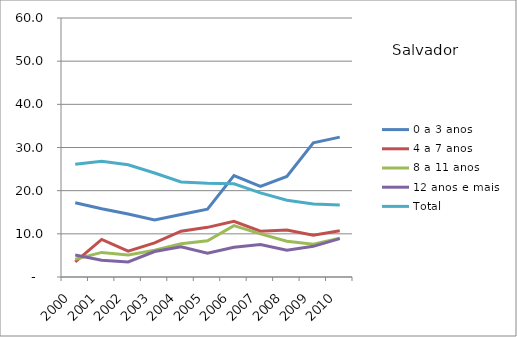
| Category | 0 a 3 anos | 4 a 7 anos | 8 a 11 anos | 12 anos e mais | Total |
|---|---|---|---|---|---|
| 2000.0 | 17.2 | 3.5 | 4.1 | 5.1 | 26.1 |
| 2001.0 | 15.8 | 8.7 | 5.7 | 3.9 | 26.8 |
| 2002.0 | 14.6 | 6 | 5.1 | 3.5 | 26 |
| 2003.0 | 13.2 | 7.9 | 6.2 | 5.9 | 24.1 |
| 2004.0 | 14.5 | 10.6 | 7.7 | 7 | 22 |
| 2005.0 | 15.7 | 11.5 | 8.4 | 5.5 | 21.7 |
| 2006.0 | 23.5 | 12.9 | 11.9 | 6.9 | 21.6 |
| 2007.0 | 21 | 10.6 | 10 | 7.5 | 19.5 |
| 2008.0 | 23.3 | 10.9 | 8.3 | 6.2 | 17.8 |
| 2009.0 | 31.1 | 9.7 | 7.6 | 7.1 | 16.9 |
| 2010.0 | 32.4 | 10.7 | 9 | 8.9 | 16.7 |